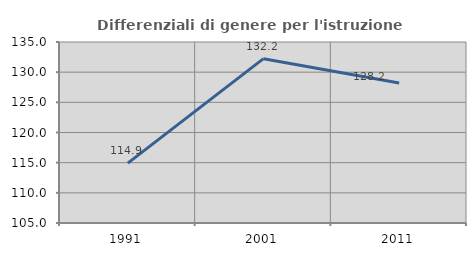
| Category | Differenziali di genere per l'istruzione superiore |
|---|---|
| 1991.0 | 114.919 |
| 2001.0 | 132.238 |
| 2011.0 | 128.201 |